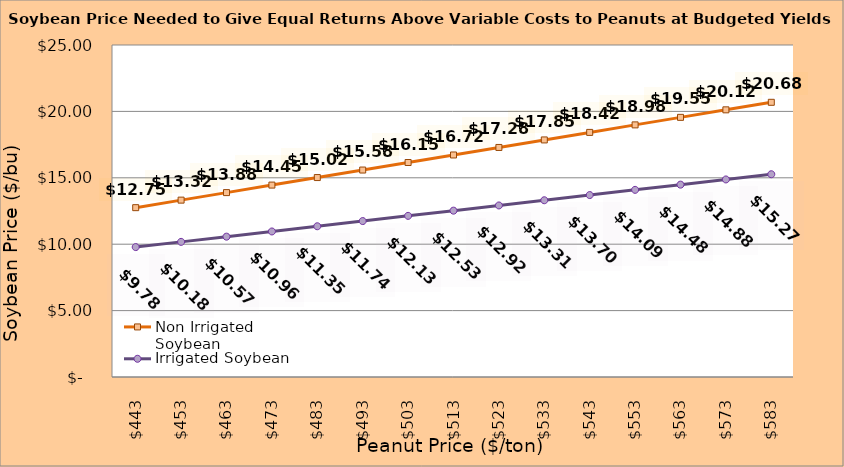
| Category | Non Irrigated Soybean | Irrigated Soybean |
|---|---|---|
| 442.5 | 12.752 | 9.784 |
| 452.5 | 13.318 | 10.176 |
| 462.5 | 13.885 | 10.567 |
| 472.5 | 14.452 | 10.959 |
| 482.5 | 15.018 | 11.351 |
| 492.5 | 15.585 | 11.742 |
| 502.5 | 16.152 | 12.134 |
| 512.5 | 16.718 | 12.526 |
| 522.5 | 17.285 | 12.917 |
| 532.5 | 17.852 | 13.309 |
| 542.5 | 18.418 | 13.701 |
| 552.5 | 18.985 | 14.092 |
| 562.5 | 19.552 | 14.484 |
| 572.5 | 20.118 | 14.876 |
| 582.5 | 20.685 | 15.267 |